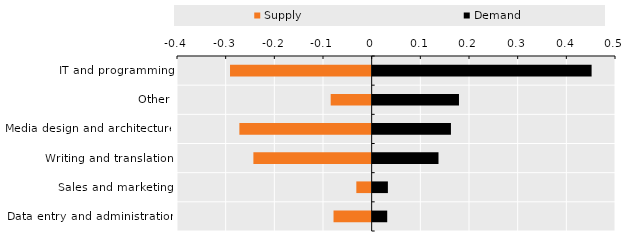
| Category | Supply | Demand |
|---|---|---|
| IT and programming | -0.291 | 0.452 |
| Other | -0.084 | 0.179 |
| Media design and architecture | -0.272 | 0.163 |
| Writing and translation | -0.243 | 0.137 |
| Sales and marketing | -0.031 | 0.033 |
| Data entry and administration | -0.078 | 0.032 |